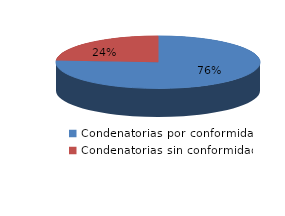
| Category | Series 0 |
|---|---|
| 0 | 35 |
| 1 | 11 |